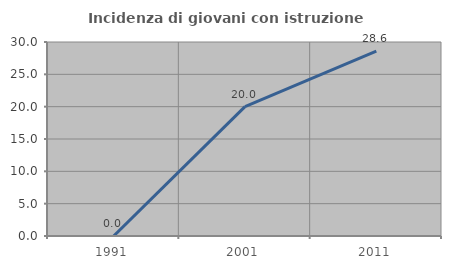
| Category | Incidenza di giovani con istruzione universitaria |
|---|---|
| 1991.0 | 0 |
| 2001.0 | 20 |
| 2011.0 | 28.571 |